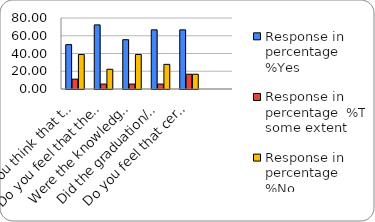
| Category | Response in percentage  |
|---|---|
| Do you think that the curriculum which you had during your graduation/post graduation has provided you with the knowledge & skills necessary to get employed/Self-employed or start own business? | 38.889 |
| Do you feel that the curriculum you studied is helpful in progression to higher studies? | 22.222 |
| Were the knowledge & skills acquired through the curriculum useful to you while working on the job?   | 38.889 |
| Did the graduation/post-graduation programme bring about any attitudinal and behavioural change in you? | 27.778 |
| Do you feel that certificate/ diploma courses offered by the college in addition to the curriculum lead to better career prospects? | 16.667 |